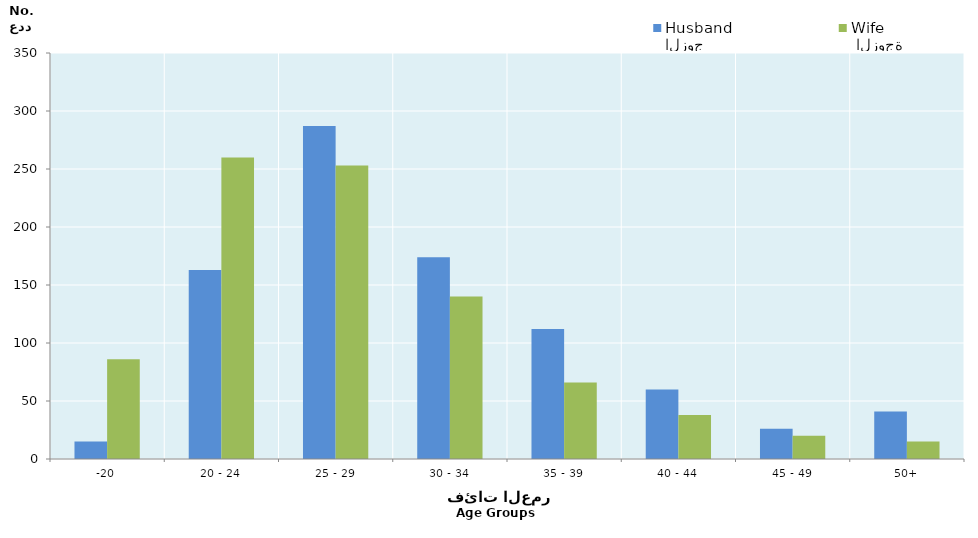
| Category | الزوج
Husband |  الزوجة
Wife |
|---|---|---|
| -20 | 15 | 86 |
| 20 - 24 | 163 | 260 |
| 25 - 29 | 287 | 253 |
| 30 - 34 | 174 | 140 |
| 35 - 39 | 112 | 66 |
| 40 - 44 | 60 | 38 |
| 45 - 49 | 26 | 20 |
| 50+ | 41 | 15 |